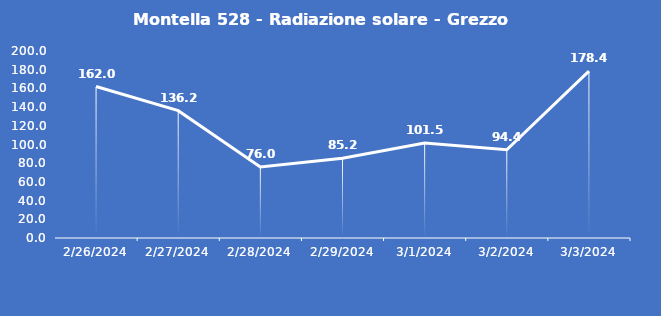
| Category | Montella 528 - Radiazione solare - Grezzo (W/m2) |
|---|---|
| 2/26/24 | 162 |
| 2/27/24 | 136.2 |
| 2/28/24 | 76 |
| 2/29/24 | 85.2 |
| 3/1/24 | 101.5 |
| 3/2/24 | 94.4 |
| 3/3/24 | 178.4 |